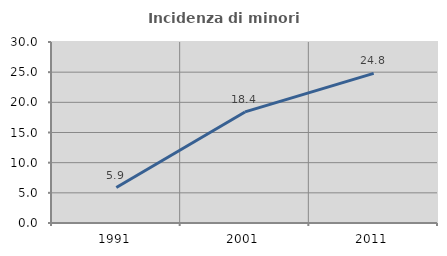
| Category | Incidenza di minori stranieri |
|---|---|
| 1991.0 | 5.882 |
| 2001.0 | 18.41 |
| 2011.0 | 24.807 |